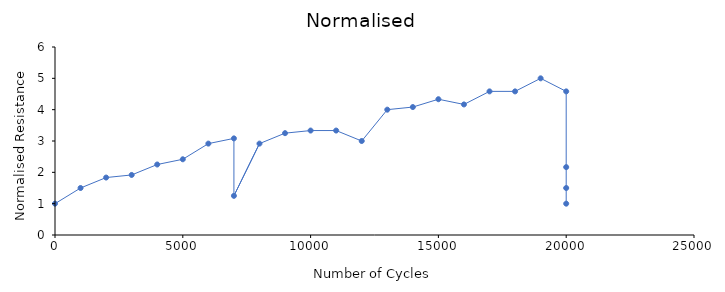
| Category | Normalised |
|---|---|
| 0.0 | 1 |
| 1000.0 | 1.5 |
| 2000.0 | 1.833 |
| 3000.0 | 1.917 |
| 4000.0 | 2.25 |
| 5000.0 | 2.417 |
| 6000.0 | 2.917 |
| 7000.0 | 3.083 |
| 7000.0 | 1.25 |
| 8000.0 | 2.917 |
| 9000.0 | 3.25 |
| 10000.0 | 3.333 |
| 11000.0 | 3.333 |
| 12000.0 | 3 |
| 13000.0 | 4 |
| 14000.0 | 4.083 |
| 15000.0 | 4.333 |
| 16000.0 | 4.167 |
| 17000.0 | 4.583 |
| 18000.0 | 4.583 |
| 19000.0 | 5 |
| 20000.0 | 4.583 |
| 20000.0 | 2.167 |
| 20000.0 | 1.5 |
| 20000.0 | 1 |